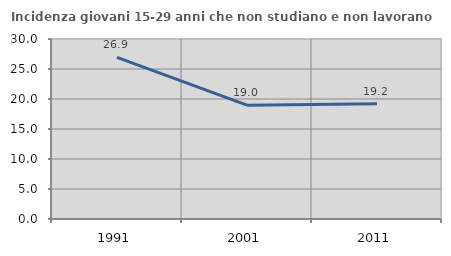
| Category | Incidenza giovani 15-29 anni che non studiano e non lavorano  |
|---|---|
| 1991.0 | 26.923 |
| 2001.0 | 18.968 |
| 2011.0 | 19.204 |